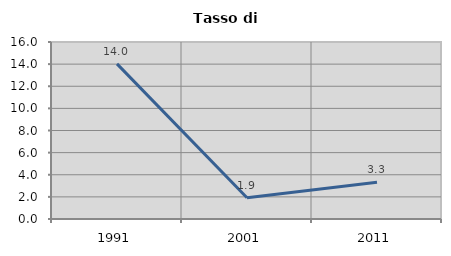
| Category | Tasso di disoccupazione   |
|---|---|
| 1991.0 | 14.019 |
| 2001.0 | 1.923 |
| 2011.0 | 3.322 |